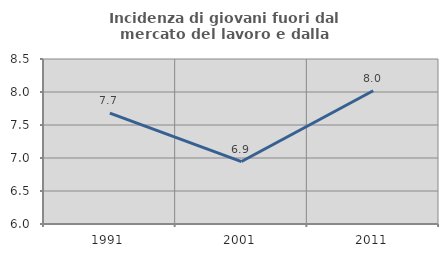
| Category | Incidenza di giovani fuori dal mercato del lavoro e dalla formazione  |
|---|---|
| 1991.0 | 7.681 |
| 2001.0 | 6.946 |
| 2011.0 | 8.018 |